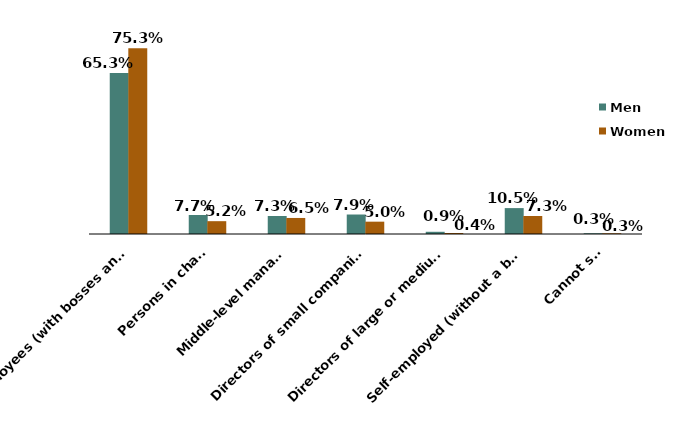
| Category | Men | Women |
|---|---|---|
|     Employees (with bosses and without subordinates) | 0.653 | 0.753 |
|     Persons in charge | 0.077 | 0.052 |
|     Middle-level managers | 0.073 | 0.065 |
|     Directors of small companies, departaments or branches | 0.079 | 0.05 |
|     Directors of large or medium-sized companies | 0.009 | 0.004 |
|     Self-employed (without a boss or subordinates) | 0.105 | 0.073 |
|     Cannot say | 0.003 | 0.003 |